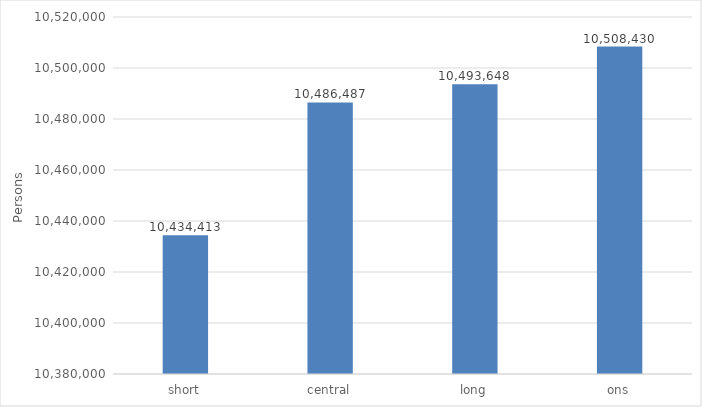
| Category | Series 0 |
|---|---|
| short | 10434412.518 |
| central | 10486486.587 |
| long | 10493648.165 |
| ons | 10508430.16 |